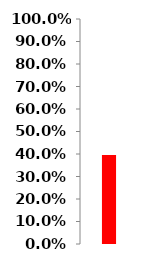
| Category | Series 0 |
|---|---|
| 0 | 0.395 |